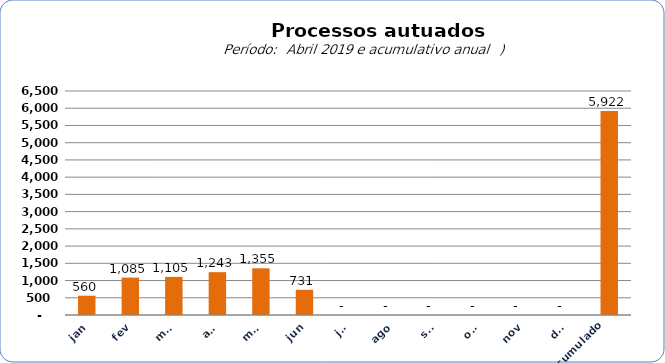
| Category |  6.735   4.276   7.967   6.893   5.569   5.644   6.997   12.080   560   1.085   1.105   1.243   1.355   731   -     -     -     -     -     -     5.922  |
|---|---|
| jan | 560 |
| fev | 1085 |
| mar | 1105 |
| abr | 1243 |
| mai | 1355 |
| jun | 731 |
| jul | 0 |
| ago | 0 |
| set | 0 |
| out | 0 |
| nov | 0 |
| dez | 0 |
| Acumulado
 | 5922 |